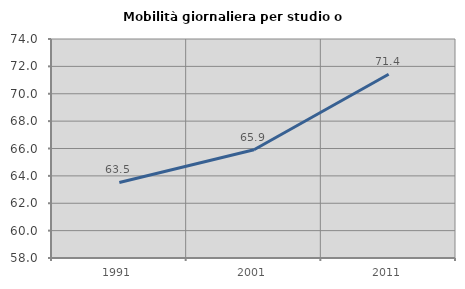
| Category | Mobilità giornaliera per studio o lavoro |
|---|---|
| 1991.0 | 63.519 |
| 2001.0 | 65.909 |
| 2011.0 | 71.429 |